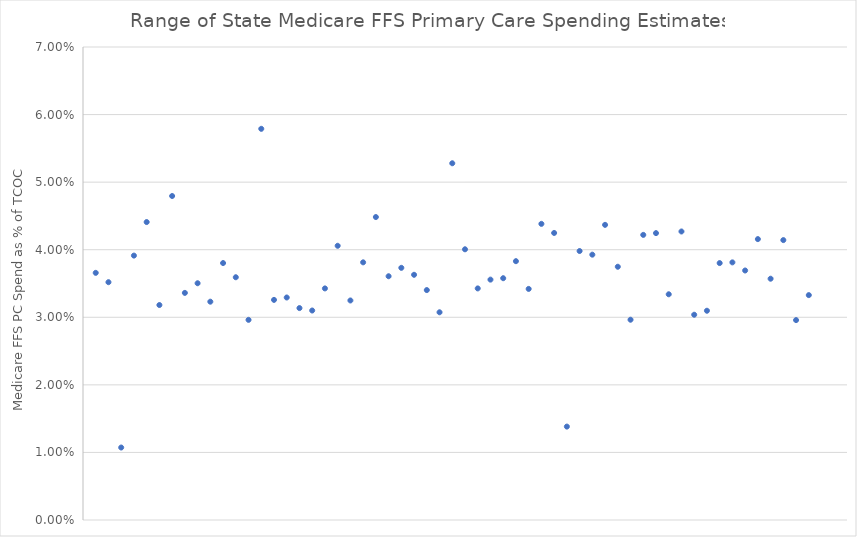
| Category | Series 0 |
|---|---|
| 0 | 0.037 |
| 1 | 0.035 |
| 2 | 0.011 |
| 3 | 0.039 |
| 4 | 0.044 |
| 5 | 0.032 |
| 6 | 0.048 |
| 7 | 0.034 |
| 8 | 0.035 |
| 9 | 0.032 |
| 10 | 0.038 |
| 11 | 0.036 |
| 12 | 0.03 |
| 13 | 0.058 |
| 14 | 0.033 |
| 15 | 0.033 |
| 16 | 0.031 |
| 17 | 0.031 |
| 18 | 0.034 |
| 19 | 0.041 |
| 20 | 0.032 |
| 21 | 0.038 |
| 22 | 0.045 |
| 23 | 0.036 |
| 24 | 0.037 |
| 25 | 0.036 |
| 26 | 0.034 |
| 27 | 0.031 |
| 28 | 0.053 |
| 29 | 0.04 |
| 30 | 0.034 |
| 31 | 0.036 |
| 32 | 0.036 |
| 33 | 0.038 |
| 34 | 0.034 |
| 35 | 0.044 |
| 36 | 0.042 |
| 37 | 0.014 |
| 38 | 0.04 |
| 39 | 0.039 |
| 40 | 0.044 |
| 41 | 0.037 |
| 42 | 0.03 |
| 43 | 0.042 |
| 44 | 0.042 |
| 45 | 0.033 |
| 46 | 0.043 |
| 47 | 0.03 |
| 48 | 0.031 |
| 49 | 0.038 |
| 50 | 0.038 |
| 51 | 0.037 |
| 52 | 0.042 |
| 53 | 0.036 |
| 54 | 0.041 |
| 55 | 0.03 |
| 56 | 0.033 |